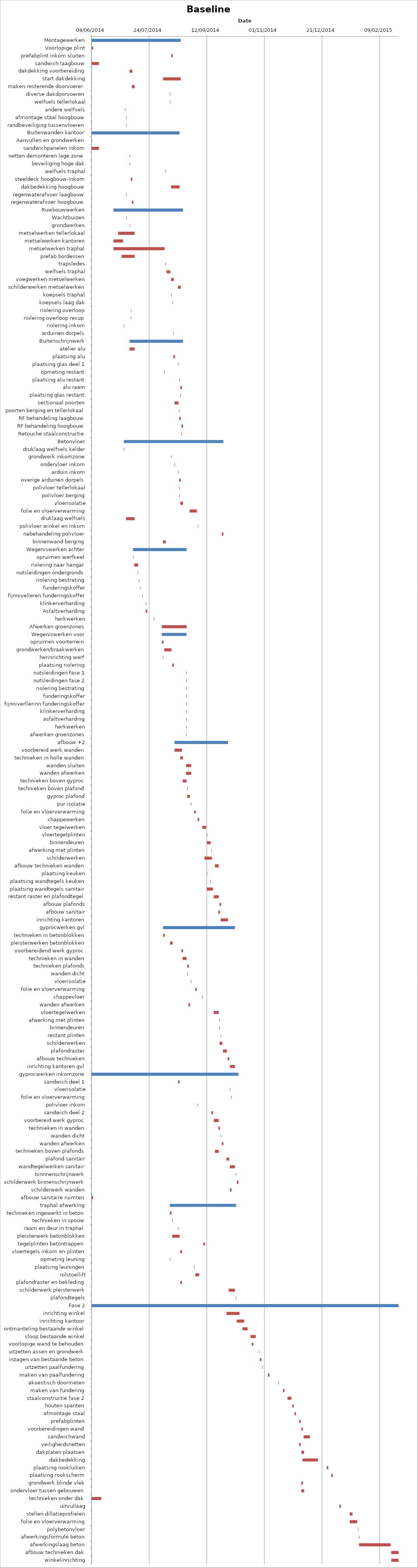
| Category | Baseline start | Actual duration |
|---|---|---|
| Montagewerken | 41794.333 | 77.375 |
| Voorlopige plint | 41794.333 | 1.375 |
| prefabplint inkom sluiten | 41863.333 | 1.375 |
| sandwich laagbouw | 41794.333 | 6.375 |
| dakdekking voorbereiding | 41827.333 | 2.375 |
| start dakdekking | 41856.333 | 15.375 |
| maken resterende doorvoerer | 41829.333 | 2.375 |
| diverse dakdoorvoeren | 41862.333 | 0.375 |
| welfsels tellerlokaal | 41862.333 | 0.375 |
| andere welfsels | 41823.333 | 0.375 |
| afmontage staal hoogbouw | 41824.333 | 0.375 |
| randbeveiliging tussenvloeren | 41824.333 | 0.375 |
| Buitenwanden kantoor | 41794.333 | 76.375 |
| Aanvullen en grondwerken | 41794.333 | 0.375 |
| sandwichpanelen inkom | 41794.333 | 6.375 |
| netten demonteren lage zone | 41827.333 | 0.375 |
| beveiliging hoge dak | 41827.333 | 0.375 |
| welfsels traphal | 41858.333 | 0.375 |
| steeldeck hoogbouw-inkom | 41828.333 | 1.375 |
| dakbedekking hoogbouw | 41863.333 | 7.375 |
| regenwaterafvoer laagbouw | 41824.333 | 0.375 |
| regenwaterafvoer hoogbouw | 41829.333 | 1.375 |
| Ruwbouwwerken | 41813.333 | 60.375 |
| Wachtbuizen | 41824.333 | 0.375 |
| grondwerken | 41827.333 | 0.375 |
| metselwerken tellerlokaal | 41817.333 | 14.375 |
| metselwerken kantoren | 41813.333 | 8.375 |
| metselwerken traphal | 41813.333 | 44.375 |
| prefab bordessen | 41820.333 | 11.375 |
| trapsledes | 41858.333 | 0.375 |
| welfsels traphal | 41859.333 | 3.375 |
| voegwerken metselwerken | 41863.333 | 2.375 |
| schilderwerken metselwerken | 41869.333 | 2.375 |
| koepsels traphal | 41863.333 | 0.375 |
| koepsels laag dak | 41864.333 | 0.375 |
| riolering overloop | 41828.333 | 0.375 |
| riolering overloop recup | 41828.333 | 0.375 |
| riolering inkom | 41822.333 | 0.375 |
| arduinen dorpels | 41865.333 | 0.375 |
| Buitenschrijnwerk | 41827.333 | 46.375 |
| atelier alu | 41827.333 | 4.375 |
| plaatsing alu | 41865.333 | 1.375 |
| plaatsing glas deel 1 | 41869.333 | 0.375 |
| opmeting restant | 41857.333 | 0.375 |
| plaatsing alu restant | 41870.333 | 0.375 |
| alu raam | 41871.333 | 1.375 |
| plaatsing glas restant | 41871.333 | 0.375 |
| sectionaal poorten | 41866.333 | 3.375 |
| poorten berging en tellerlokaal | 41870.333 | 0.375 |
| RF behandeling laagbouw | 41870.333 | 1.375 |
| RF behandeling hoogbouw | 41872.333 | 1.375 |
| Retouche staalconstructie | 41872.333 | 0.375 |
| Betonvloer | 41822.333 | 86.375 |
| druklaag welfsels kelder | 41822.333 | 0.375 |
| grondwerk inkomzone | 41863.333 | 0.375 |
| ondervloer inkom | 41866.333 | 0.375 |
| arduin inkom | 41869.333 | 0.375 |
| overige arduinen dorpels | 41870.333 | 1.375 |
| polivloer tellerlokaal | 41870.333 | 0.375 |
| polivloer berging | 41870.333 | 0.375 |
| vloerisolatie | 41871.333 | 2.375 |
| folie en vloerverwarming | 41879.333 | 6.375 |
| druklaag welfsels | 41824.333 | 7.375 |
| polivloer winkel en inkom | 41886.333 | 0.375 |
| nabehandeling polivloer | 41907.333 | 1.375 |
| binnenwand berging | 41856.333 | 2.375 |
| Wegeniswerken achter | 41830.333 | 46.375 |
| opruimen werfkeet | 41830.333 | 0.375 |
| riolering naar hangar | 41831.333 | 3.375 |
| nutsleidingen ondergronds | 41834.333 | 0.375 |
| riolering bestrating | 41835.333 | 0.375 |
| funderingskoffer | 41836.333 | 0.375 |
| fijnnivelleren funderingskoffer | 41838.333 | 0.375 |
| klinkerverharding | 41841.333 | 0.375 |
| Asfaltverharding | 41841.333 | 1.375 |
| herkwerken | 41848.333 | 0.375 |
| Afwerken groenzones | 41855.333 | 21.375 |
| Wegeniswerken voor | 41855.333 | 21.375 |
| opruimen voorterrein | 41855.333 | 1.375 |
| grondwerken/braakwerken | 41857.333 | 6.375 |
| herinrichting werf | 41856.333 | 0.375 |
| plaatsing riolering | 41864.333 | 1.375 |
| nutsleidingen fase 1 | 41876.333 | 0.375 |
| nutsleidingen fase 2 | 41876.333 | 0.375 |
| riolering bestrating | 41876.333 | 0.375 |
| funderingskoffer | 41876.333 | 0.375 |
| fijnniverllerinn funderingskoffer | 41876.333 | 0.375 |
| klinkerverharding | 41876.333 | 0.375 |
| asfaltverharding | 41876.333 | 0.375 |
| herkwerken | 41876.333 | 0.375 |
| afwerken groenzones | 41876.333 | 0.375 |
| afbouw +2 | 41866.333 | 46.375 |
| voorbereid werk wanden | 41866.333 | 6.375 |
| technieken in holle wanden | 41871.333 | 2.375 |
| wanden sluiten | 41876.333 | 4.375 |
| wanden afwerken | 41876.333 | 4.375 |
| technieken boven gyproc | 41873.333 | 3.375 |
| technieken boven plafond | 41877.333 | 0.375 |
| gyproc plafond | 41877.333 | 2.375 |
| pur isolatie | 41880.333 | 0.375 |
| folie en vloerverwarming | 41883.333 | 1.375 |
| chappewerken | 41886.333 | 1.375 |
| vloer tegelwerken | 41890.333 | 3.375 |
| vloertegelplinten | 41894.333 | 0.375 |
| binnendeuren | 41894.333 | 3.375 |
| afwerking met plinten | 41898.333 | 0.375 |
| schilderwerken | 41892.333 | 6.375 |
| afbouw technieken wanden | 41901.333 | 3.375 |
| plaatsing keuken | 41894.333 | 0.375 |
| plaatsing wandtegels keuken | 41897.333 | 0.375 |
| plaatsing wandtegels sanitair | 41894.333 | 5.375 |
| restant raster en plafondtegel | 41900.333 | 4.375 |
| afbouw plafonds | 41905.333 | 1.375 |
| afbouw sanitair | 41904.333 | 1.375 |
| inrichting kantoren | 41906.333 | 6.375 |
| gyprocwerken gvl | 41856.333 | 62.375 |
| technieken in betonblokken | 41856.333 | 1.375 |
| pleisterwerken betonblokken | 41862.333 | 2.375 |
| voorbereidend werk gyproc | 41872.333 | 1.375 |
| technieken in wanden | 41873.333 | 3.375 |
| technieken plafonds | 41877.333 | 1.375 |
| wanden dicht | 41877.333 | 0.375 |
| vloerisolatie | 41880.333 | 0.375 |
| folie en vloerverwarming | 41884.333 | 1.375 |
| chappevloer | 41890.333 | 0.375 |
| wanden afwerken | 41878.333 | 1.375 |
| vloertegelwerken | 41900.333 | 4.375 |
| afwerking met plinten | 41905.333 | 0.375 |
| binnendeuren | 41905.333 | 0.375 |
| restant plinten | 41906.333 | 0.375 |
| schilderwerken | 41905.333 | 2.375 |
| plafondraster | 41908.333 | 3.375 |
| afbouw technieken | 41912.333 | 1.375 |
| inrichting kantoren gvl | 41914.333 | 4.375 |
| gyprocwerken inkomzone | 41794.333 | 127.375 |
| sandwich deel 1 | 41869.333 | 1.375 |
| vloerisolatie | 41914.333 | 0.375 |
| folie en vloerverwarming | 41915.333 | 0.375 |
| polivloer inkom | 41886.333 | 0.375 |
| sandwich deel 2 | 41898.333 | 1.375 |
| voorbereid werk gyproc | 41900.333 | 4.375 |
| technieken in wanden | 41904.333 | 1.375 |
| wanden dicht | 41906.333 | 0.375 |
| wanden afwerken | 41907.333 | 1.375 |
| technieken boven plafonds | 41901.333 | 3.375 |
| plafond sanitair | 41911.333 | 2.375 |
| wandtegelwerken sanitair | 41914.333 | 4.375 |
| binnnenschrijnwerk | 41919.333 | 0.375 |
| schilderwerk binnenschrijnwerk | 41920.333 | 1.375 |
| schilderwerk wanden | 41914.333 | 1.375 |
| afbouw sanitaire ruimten | 41794.333 | 1.375 |
| traphal afwerking | 41862.333 | 57.375 |
| technieken ingewerkt in beton | 41862.333 | 1.375 |
| technieken in spouw | 41864.333 | 0.375 |
| raam en deur in traphal | 41869.333 | 0.375 |
| pleisterwerk betonblokken | 41864.333 | 6.375 |
| tegelplinten betontrappen | 41891.333 | 1.375 |
| vloertegels inkom en plinten | 41871.333 | 1.375 |
| opmeting leuning | 41862.333 | 0.375 |
| plaatsing leuningen | 41883.333 | 0.375 |
| rolstoellift | 41884.333 | 3.375 |
| plafondraster en bekleding | 41871.333 | 1.375 |
| schilderwerk pleisterwerk | 41913.333 | 5.375 |
| plafondtegels | 41919.333 | 0.375 |
| Fase 2 | 41794.333 | 266.375 |
| inrichting winkel | 41911.333 | 11.375 |
| inrichting kantoor | 41920.333 | 6.375 |
| ontmanteling bestaande winkel | 41925.333 | 4.375 |
| sloop bestaande winkel | 41932.333 | 4.375 |
| voorlopige wand te behouden | 41933.333 | 1.375 |
| uitzetten assen en grondwerk | 41939.333 | 0.375 |
| inzagen van bestaande beton | 41940.333 | 1.375 |
| uitzetten paalfundering | 41942.333 | 0.375 |
| maken van paalfundering | 41947.333 | 1.375 |
| akoestisch doormeten | 41956.333 | 0.375 |
| maken van fundering | 41960.333 | 1.375 |
| staalconstructie fase 2 | 41964.333 | 3.375 |
| houten spanten | 41968.333 | 1.375 |
| afmontage staal | 41970.333 | 1.375 |
| prefabplinten | 41974.333 | 1.375 |
| voorbereidingen wand | 41976.333 | 1.375 |
| sandwichwand | 41978.333 | 5.375 |
| veiligheidsnetten | 41974.333 | 1.375 |
| dakplaten plaatsen | 41976.333 | 2.375 |
| dakbedekking | 41977.333 | 13.375 |
| plaatsing rookluiken | 41998.333 | 1.375 |
| plaatsing rookscherm | 42002.333 | 1.375 |
| grondwerk blinde vlek | 41976.333 | 1.375 |
| ondervloer tussen gebouwen | 41976.333 | 2.375 |
| technieken onder dak | 41794.333 | 8.375 |
| uitvullaag | 42009.333 | 1.375 |
| stellen dillatieprofielen | 42018.333 | 2.375 |
| folie en vloerverwarming | 42018.333 | 6.375 |
| polybetonvloer | 42025.333 | 0.375 |
| afwerkingsformule beton | 42026.333 | 0.375 |
| afwerkingslaag beton | 42026.333 | 27.375 |
| afbouw technieken dak | 42054.333 | 6.375 |
| winkelinrichting | 42054.333 | 6.375 |